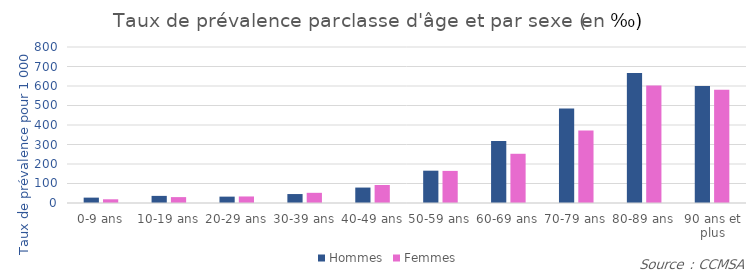
| Category | Hommes | Femmes |
|---|---|---|
| 0-9 ans | 27.538 | 19.013 |
| 10-19 ans | 36.494 | 30.174 |
| 20-29 ans | 32.658 | 33.515 |
| 30-39 ans | 45.931 | 52.206 |
| 40-49 ans | 79.165 | 92.278 |
| 50-59 ans | 165.7 | 164.579 |
| 60-69 ans | 318.054 | 252.417 |
| 70-79 ans | 484.545 | 372.125 |
| 80-89 ans | 667.273 | 603.153 |
| 90 ans et plus | 599.599 | 581.32 |